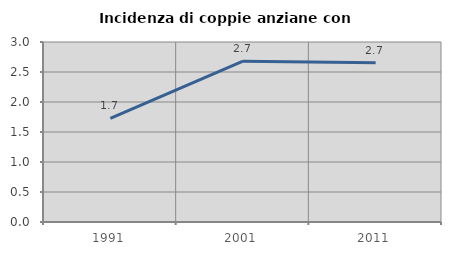
| Category | Incidenza di coppie anziane con figli |
|---|---|
| 1991.0 | 1.727 |
| 2001.0 | 2.68 |
| 2011.0 | 2.655 |